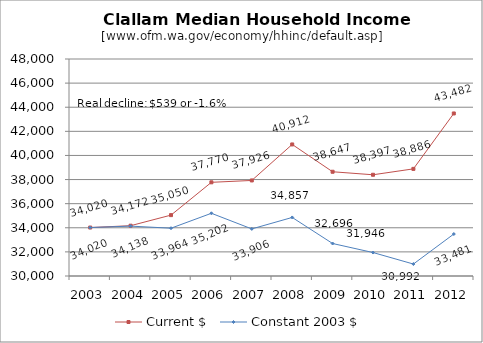
| Category | Current $ | Constant 2003 $ |
|---|---|---|
| 2003.0 | 34019.688 | 34019.688 |
| 2004.0 | 34172.426 | 34138.254 |
| 2005.0 | 35050.151 | 33963.596 |
| 2006.0 | 37770.037 | 35201.675 |
| 2007.0 | 37925.73 | 33905.602 |
| 2008.0 | 40912.349 | 34857.322 |
| 2009.0 | 38647.177 | 32695.512 |
| 2010.0 | 38397 | 31946.304 |
| 2011.0 | 38885.97 | 30992.118 |
| 2012.0 | 43482 | 33481.14 |